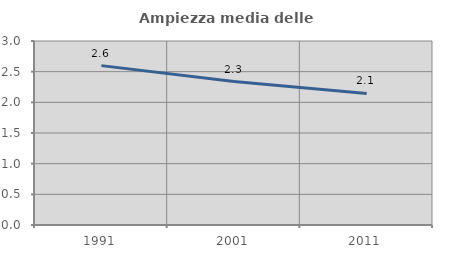
| Category | Ampiezza media delle famiglie |
|---|---|
| 1991.0 | 2.599 |
| 2001.0 | 2.339 |
| 2011.0 | 2.145 |